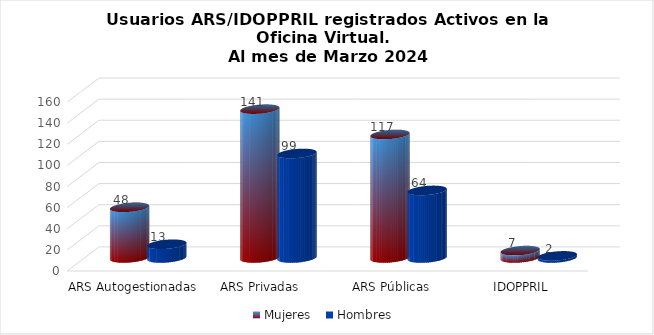
| Category | Mujeres | Hombres |
|---|---|---|
| ARS Autogestionadas | 48 | 13 |
| ARS Privadas | 141 | 99 |
| ARS Públicas | 117 | 64 |
| IDOPPRIL | 7 | 2 |